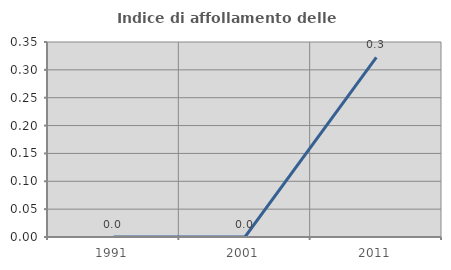
| Category | Indice di affollamento delle abitazioni  |
|---|---|
| 1991.0 | 0 |
| 2001.0 | 0 |
| 2011.0 | 0.323 |